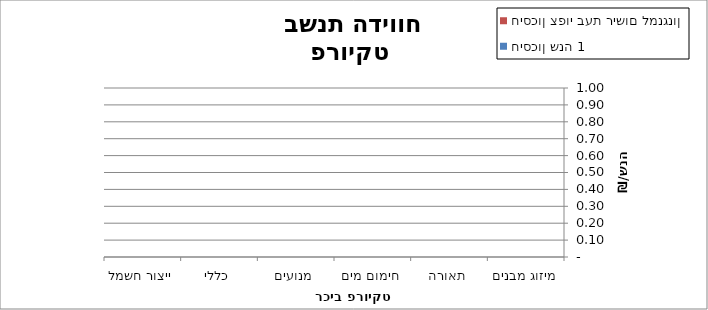
| Category | חיסכון צפוי בעת רישום למנגנון | חיסכון שנה 1 |
|---|---|---|
| מיזוג מבנים | 0 | 0 |
| תאורה | 0 | 0 |
| חימום מים | 0 | 0 |
| מנועים | 0 | 0 |
| כללי | 0 | 0 |
| ייצור חשמל | 0 | 0 |